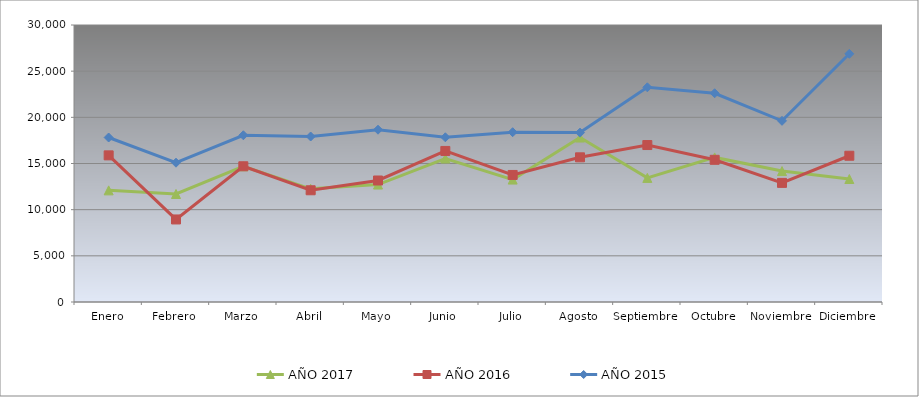
| Category | AÑO 2017 | AÑO 2016 | AÑO 2015 |
|---|---|---|---|
| Enero | 12090 | 15880 | 17814.421 |
| Febrero | 11700 | 8940 | 15085.351 |
| Marzo | 14700 | 14700 | 18058.157 |
| Abril | 12260 | 12100 | 17923.732 |
| Mayo | 12720 | 13160 | 18658.849 |
| Junio | 15540 | 16360 | 17838.803 |
| Julio | 13260 | 13760 | 18389.718 |
| Agosto | 17810 | 15670 | 18344.723 |
| Septiembre | 13440 | 17000 | 23252.904 |
| Octubre | 15660 | 15400 | 22609.466 |
| Noviembre | 14180 | 12900 | 19621.052 |
| Diciembre | 13320 | 15840 | 26879.732 |